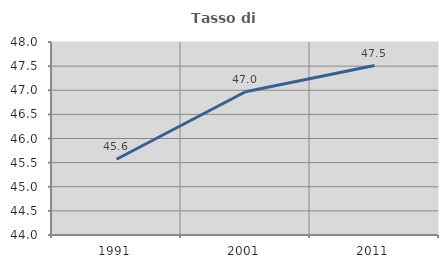
| Category | Tasso di occupazione   |
|---|---|
| 1991.0 | 45.57 |
| 2001.0 | 46.969 |
| 2011.0 | 47.513 |